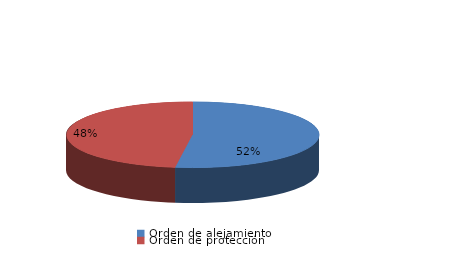
| Category | Series 0 |
|---|---|
| Orden de alejamiento | 12 |
| Orden de protección | 11 |